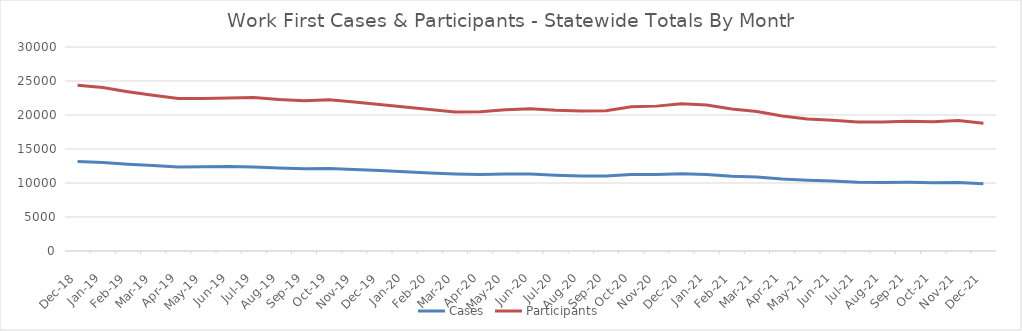
| Category | Cases | Participants |
|---|---|---|
| 2021-12-21 | 9885 | 18776 |
| 2021-11-21 | 10056 | 19192 |
| 2021-10-21 | 10034 | 19005 |
| 2021-09-21 | 10102 | 19085 |
| 2021-08-21 | 10090 | 18974 |
| 2021-07-21 | 10121 | 18988 |
| 2021-06-21 | 10298 | 19211 |
| 2021-05-21 | 10411 | 19413 |
| 2021-04-21 | 10601 | 19845 |
| 2021-03-21 | 10888 | 20521 |
| 2021-02-21 | 11007 | 20877 |
| 2021-01-21 | 11252 | 21466 |
| 2020-12-20 | 11350 | 21641 |
| 2020-11-20 | 11255 | 21305 |
| 2020-10-20 | 11243 | 21198 |
| 2020-09-20 | 11030 | 20626 |
| 2020-08-20 | 11034 | 20575 |
| 2020-07-20 | 11137 | 20693 |
| 2020-06-20 | 11320 | 20921 |
| 2020-05-20 | 11330 | 20766 |
| 2020-04-20 | 11263 | 20490 |
| 2020-03-20 | 11330 | 20431 |
| 2020-02-20 | 11473 | 20821 |
| 2020-01-20 | 11654 | 21174 |
| 2019-12-19 | 11822 | 21539 |
| 2019-11-19 | 11990 | 21921 |
| 2019-10-19 | 12136 | 22233 |
| 2019-09-19 | 12092 | 22105 |
| 2019-08-19 | 12206 | 22284 |
| 2019-07-19 | 12346 | 22563 |
| 2019-06-19 | 12412 | 22512 |
| 2019-05-19 | 12393 | 22436 |
| 2019-04-19 | 12365 | 22412 |
| 2019-03-01 | 12560 | 22890 |
| 2019-02-01 | 12766 | 23428 |
| 2019-01-01 | 13027 | 24029 |
| 2018-12-01 | 13157 | 24372 |